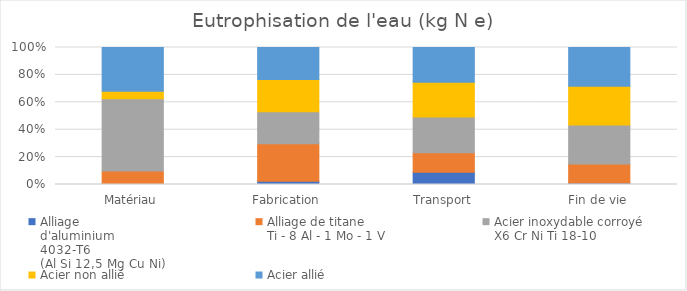
| Category | Alliage
d'aluminium
4032-T6
(Al Si 12,5 Mg Cu Ni) | Alliage de titane
Ti - 8 Al - 1 Mo - 1 V | Acier inoxydable corroyé
X6 Cr Ni Ti 18-10 | Acier non allié
C 60 | Acier allié
14 Ni Cr Mo 13-4 |
|---|---|---|---|---|---|
| Matériau | 0 | 0.007 | 0.038 | 0.004 | 0.023 |
| Fabrication | 0 | 0 | 0 | 0 | 0 |
| Transport | 0 | 0 | 0 | 0 | 0 |
| Fin de vie | 0 | 0 | 0 | 0 | 0 |